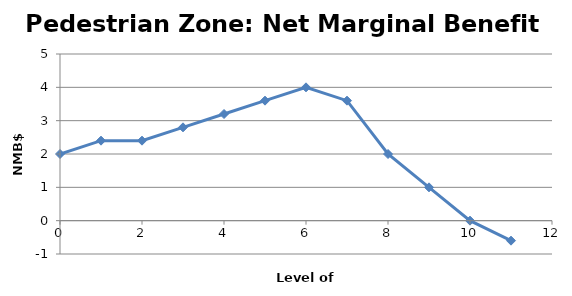
| Category | Pedestrian Zone |
|---|---|
| 0.0 | 2 |
| 1.0 | 2.4 |
| 2.0 | 2.4 |
| 3.0 | 2.8 |
| 4.0 | 3.2 |
| 5.0 | 3.6 |
| 6.0 | 4 |
| 7.0 | 3.6 |
| 8.0 | 2 |
| 9.0 | 1 |
| 10.0 | 0 |
| 11.0 | -0.6 |